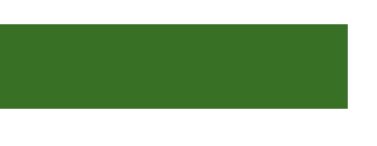
| Category | Series 0 |
|---|---|
| 0 | 1113500 |
| 1 | 652500 |